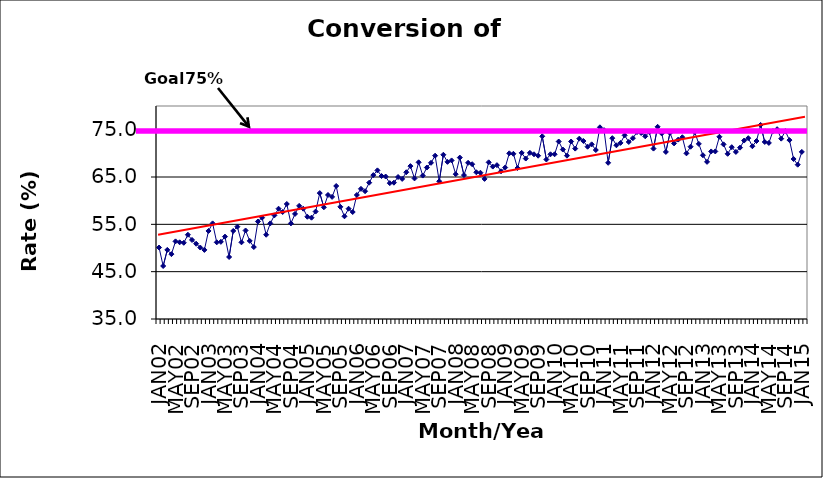
| Category | Series 0 |
|---|---|
| JAN02 | 50.1 |
| FEB02 | 46.2 |
| MAR02 | 49.6 |
| APR02 | 48.7 |
| MAY02 | 51.4 |
| JUN02 | 51.2 |
| JUL02 | 51.1 |
| AUG02 | 52.8 |
| SEP02 | 51.7 |
| OCT02 | 50.9 |
| NOV02 | 50.1 |
| DEC02 | 49.6 |
| JAN03 | 53.6 |
| FEB03 | 55.2 |
| MAR03 | 51.2 |
| APR03 | 51.3 |
| MAY03 | 52.4 |
| JUN03 | 48.1 |
| JUL03 | 53.6 |
| AUG03 | 54.5 |
| SEP03 | 51.2 |
| OCT03 | 53.7 |
| NOV03 | 51.5 |
| DEC03 | 50.2 |
| JAN04 | 55.6 |
| FEB04 | 56.4 |
| MAR04 | 52.8 |
| APR04 | 55.2 |
| MAY04 | 56.9 |
| JUN04 | 58.3 |
| JUL04 | 57.6 |
| AUG04 | 59.3 |
| SEP04 | 55.2 |
| OCT04 | 57.2 |
| NOV04 | 58.9 |
| DEC04 | 58.3 |
| JAN05 | 56.6 |
| FEB05 | 56.4 |
| MAR05 | 57.7 |
| APR05 | 61.6 |
| MAY05 | 58.6 |
| JUN05 | 61.2 |
| JUL05 | 60.8 |
| AUG05 | 63.1 |
| SEP05 | 58.7 |
| OCT05 | 56.7 |
| NOV05 | 58.3 |
| DEC05 | 57.6 |
| JAN06 | 61.2 |
| FEB06 | 62.5 |
| MAR06 | 62 |
| APR06 | 63.8 |
| MAY06 | 65.4 |
| JUN06 | 66.4 |
| JUL06 | 65.2 |
| AUG06 | 65.1 |
| SEP06 | 63.7 |
| OCT06 | 63.8 |
| NOV06 | 65 |
| DEC06 | 64.6 |
| JAN07 | 66 |
| FEB07 | 67.3 |
| MAR07 | 64.7 |
| APR07 | 68.1 |
| MAY07 | 65.3 |
| JUN07 | 67 |
| JUL07 | 68 |
| AUG07 | 69.5 |
| SEP07 | 64.1 |
| OCT07 | 69.7 |
| NOV07 | 68.2 |
| DEC07 | 68.5 |
| JAN08 | 65.6 |
| FEB08 | 69.1 |
| MAR08 | 65.4 |
| APR08 | 68 |
| MAY08 | 67.7 |
| JUN08 | 66 |
| JUL08 | 65.9 |
| AUG08 | 64.6 |
| SEP08 | 68.1 |
| OCT08 | 67.2 |
| NOV08 | 67.5 |
| DEC08 | 66.2 |
| JAN09 | 67 |
| FEB09 | 70 |
| MAR09 | 69.9 |
| APR09 | 66.9 |
| MAY09 | 70.1 |
| JUN09 | 68.9 |
| JUL09 | 70.1 |
| AUG09 | 69.8 |
| SEP09 | 69.5 |
| OCT09 | 73.6 |
| NOV09 | 68.7 |
| DEC09 | 69.8 |
| JAN10 | 69.8 |
| FEB10 | 72.5 |
| MAR10 | 70.8 |
| APR10 | 69.5 |
| MAY10 | 72.5 |
| JUN10 | 71 |
| JUL10 | 73.1 |
| AUG10 | 72.6 |
| SEP10 | 71.4 |
| OCT10 | 71.9 |
| NOV10 | 70.7 |
| DEC10 | 75.5 |
| JAN11 | 74.9 |
| FEB11 | 68 |
| MAR11 | 73.2 |
| APR11 | 71.7 |
| MAY11 | 72.2 |
| JUN11 | 73.8 |
| JUL11 | 72.4 |
| AUG11 | 73.2 |
| SEP11 | 74.5 |
| OCT11 | 74.3 |
| NOV11 | 73.6 |
| DEC11 | 74.5 |
| JAN12 | 71 |
| FEB12 | 75.6 |
| MAR12 | 74.2 |
| APR12 | 70.3 |
| MAY12 | 74.3 |
| JUN12 | 72.1 |
| JUL12 | 72.9 |
| AUG12 | 73.4 |
| SEP12 | 70 |
| OCT12 | 71.4 |
| NOV12 | 74.5 |
| DEC12 | 72 |
| JAN13 | 69.6 |
| FEB13 | 68.2 |
| MAR13 | 70.4 |
| APR13 | 70.4 |
| MAY13 | 73.5 |
| JUN13 | 71.9 |
| JUL13 | 69.9 |
| AUG13 | 71.3 |
| SEP13 | 70.3 |
| OCT13 | 71.2 |
| NOV13 | 72.7 |
| DEC13 | 73.2 |
| JAN14 | 71.5 |
| FEB14 | 72.6 |
| MAR14 | 76 |
| APR14 | 72.4 |
| MAY14 | 72.2 |
| JUN14 | 74.7 |
| JUL14 | 75.1 |
| AUG14 | 73.1 |
| SEP14 | 74.7 |
| OCT14 | 72.8 |
| NOV14 | 68.8 |
| DEC14 | 67.6 |
| JAN15 | 70.3 |